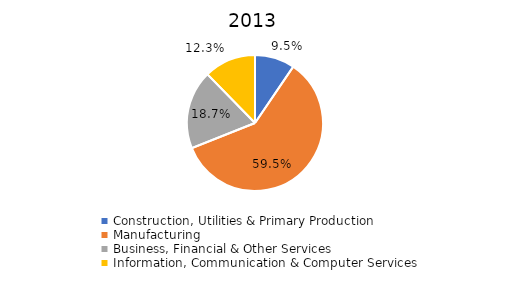
| Category | Series 0 |
|---|---|
| Construction, Utilities & Primary Production  | 0.095 |
| Manufacturing  | 0.595 |
| Business, Financial & Other Services | 0.187 |
| Information, Communication & Computer Services | 0.123 |